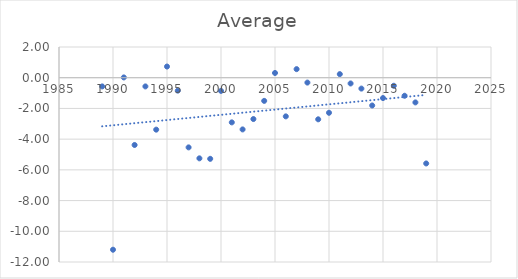
| Category | Average |
|---|---|
| 1989.0 | -0.567 |
| 1990.0 | -11.2 |
| 1991.0 | 0.018 |
| 1992.0 | -4.38 |
| 1993.0 | -0.567 |
| 1994.0 | -3.382 |
| 1995.0 | 0.727 |
| 1996.0 | -0.842 |
| 1997.0 | -4.536 |
| 1998.0 | -5.25 |
| 1999.0 | -5.282 |
| 2000.0 | -0.858 |
| 2001.0 | -2.908 |
| 2002.0 | -3.367 |
| 2003.0 | -2.691 |
| 2004.0 | -1.508 |
| 2005.0 | 0.308 |
| 2006.0 | -2.517 |
| 2007.0 | 0.558 |
| 2008.0 | -0.317 |
| 2009.0 | -2.708 |
| 2010.0 | -2.283 |
| 2011.0 | 0.233 |
| 2012.0 | -0.375 |
| 2013.0 | -0.708 |
| 2014.0 | -1.808 |
| 2015.0 | -1.325 |
| 2016.0 | -0.525 |
| 2017.0 | -1.175 |
| 2018.0 | -1.608 |
| 2019.0 | -5.583 |